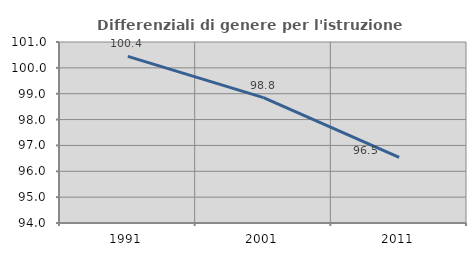
| Category | Differenziali di genere per l'istruzione superiore |
|---|---|
| 1991.0 | 100.446 |
| 2001.0 | 98.848 |
| 2011.0 | 96.534 |